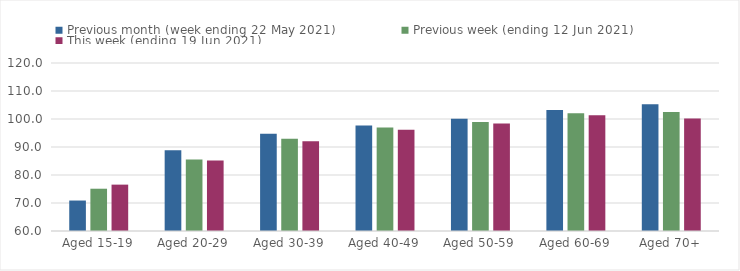
| Category | Previous month (week ending 22 May 2021) | Previous week (ending 12 Jun 2021) | This week (ending 19 Jun 2021) |
|---|---|---|---|
| Aged 15-19 | 70.88 | 75.1 | 76.56 |
| Aged 20-29 | 88.82 | 85.58 | 85.18 |
| Aged 30-39 | 94.71 | 92.93 | 92.01 |
| Aged 40-49 | 97.71 | 96.95 | 96.16 |
| Aged 50-59 | 100.13 | 98.92 | 98.38 |
| Aged 60-69 | 103.22 | 102.01 | 101.31 |
| Aged 70+ | 105.3 | 102.54 | 100.14 |